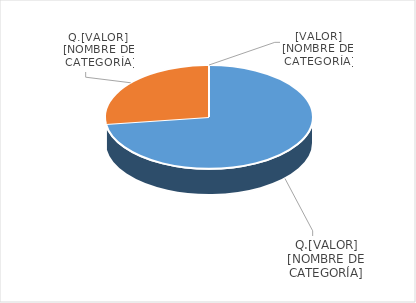
| Category | Series 0 |
|---|---|
| PRESUPUESTO VIGENTE PARA 2023 | 19000000 |
| PRESUPUESTO EJECUTADO  | 7079350.6 |
| PORCENTAJE DE EJECUCIÓN  | 0.373 |